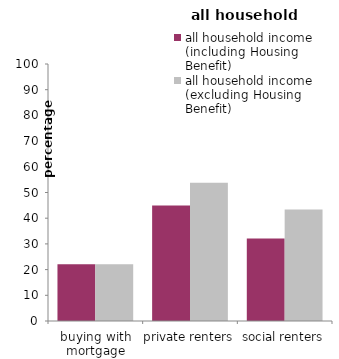
| Category | all household income 
(including Housing Benefit) | all household income 
(excluding Housing Benefit) |
|---|---|---|
| buying with mortgage | 22.041 | 22.041 |
| private renters | 44.932 | 53.762 |
| social renters | 32.114 | 43.373 |